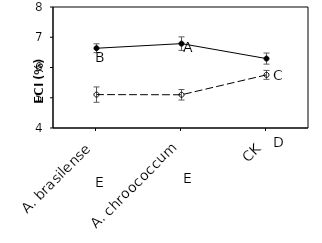
| Category | aCO2 | eCO2 |
|---|---|---|
|    A. brasilense | 6.636 | 5.104 |
|    A. chroococcum | 6.789 | 5.099 |
| CK | 6.295 | 5.756 |